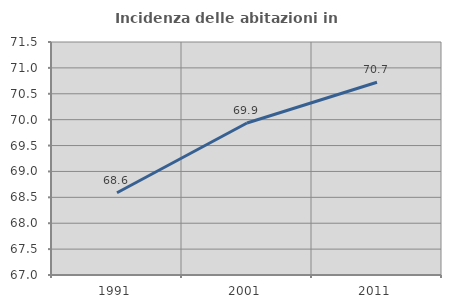
| Category | Incidenza delle abitazioni in proprietà  |
|---|---|
| 1991.0 | 68.589 |
| 2001.0 | 69.936 |
| 2011.0 | 70.723 |